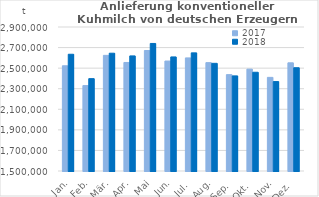
| Category | 2017 | 2018 |
|---|---|---|
| Jan. | 2523078.708 | 2635042.782 |
| Feb. | 2330371.304 | 2397796.649 |
| Mär. | 2624246.113 | 2645142.871 |
| Apr. | 2555146.12 | 2618882.994 |
| Mai | 2671585.814 | 2739891.619 |
| Jun. | 2569110.989 | 2608957.964 |
| Jul. | 2599442.785 | 2648563.822 |
| Aug. | 2553555.765 | 2546749.907 |
| Sep. | 2436926.228 | 2424569.386 |
| Okt. | 2490419.964 | 2460015.466 |
| Nov. | 2410350.894 | 2369477.673 |
| Dez. | 2551810.371 | 2504043.412 |